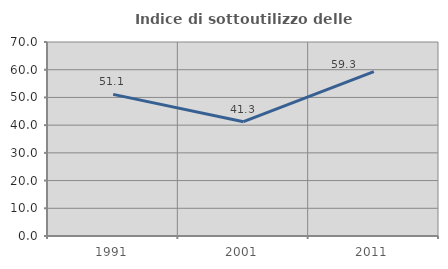
| Category | Indice di sottoutilizzo delle abitazioni  |
|---|---|
| 1991.0 | 51.101 |
| 2001.0 | 41.25 |
| 2011.0 | 59.307 |